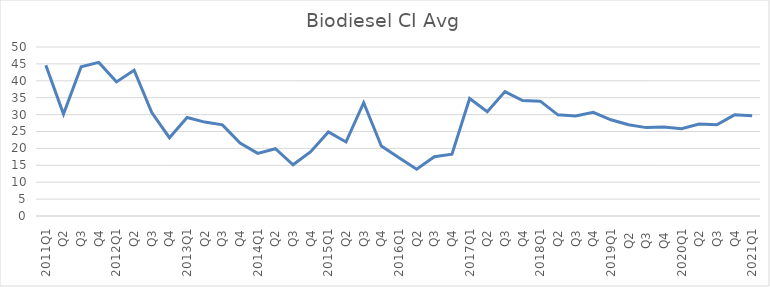
| Category | Series 0 |
|---|---|
| 2011Q1 | 44.57 |
| Q2 | 30.14 |
| Q3 | 44.16 |
| Q4 | 45.45 |
| 2012Q1 | 39.68 |
| Q2 | 43.15 |
| Q3 | 30.58 |
| Q4 | 23.16 |
| 2013Q1 | 29.14 |
| Q2 | 27.78 |
| Q3 | 26.97 |
| Q4 | 21.59 |
| 2014Q1 | 18.52 |
| Q2 | 19.91 |
| Q3 | 15.16 |
| Q4 | 19.04 |
| 2015Q1 | 24.88 |
| Q2 | 21.9 |
| Q3 | 33.51 |
| Q4 | 20.7 |
| 2016Q1 | 17.25 |
| Q2 | 13.83 |
| Q3 | 17.53 |
| Q4 | 18.31 |
| 2017Q1 | 34.76 |
| Q2 | 30.84 |
| Q3 | 36.82 |
| Q4 | 34.15 |
| 2018Q1 | 33.97 |
| Q2 | 29.93 |
| Q3 | 29.61 |
| Q4 | 30.67 |
| 2019Q1 | 28.46 |
|  Q2  | 26.98 |
|  Q3  | 26.15 |
|  Q4  | 26.34 |
| 2020Q1 | 25.84 |
| Q2 | 27.23 |
| Q3 | 27.01 |
| Q4 | 29.93 |
| 2021Q1 | 29.69 |